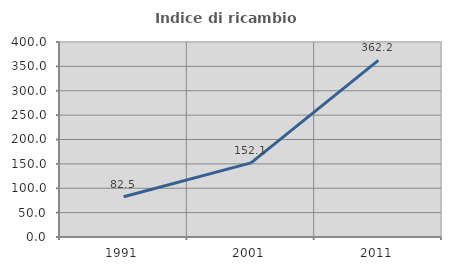
| Category | Indice di ricambio occupazionale  |
|---|---|
| 1991.0 | 82.477 |
| 2001.0 | 152.055 |
| 2011.0 | 362.238 |